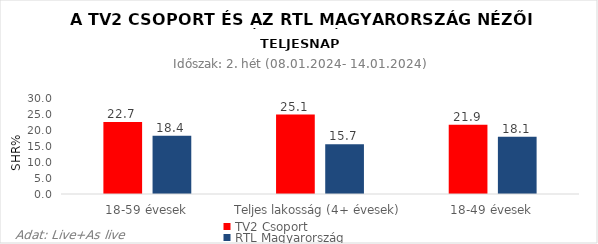
| Category | TV2 Csoport | RTL Magyarország |
|---|---|---|
| 18-59 évesek | 22.7 | 18.4 |
| Teljes lakosság (4+ évesek) | 25.1 | 15.7 |
| 18-49 évesek | 21.9 | 18.1 |